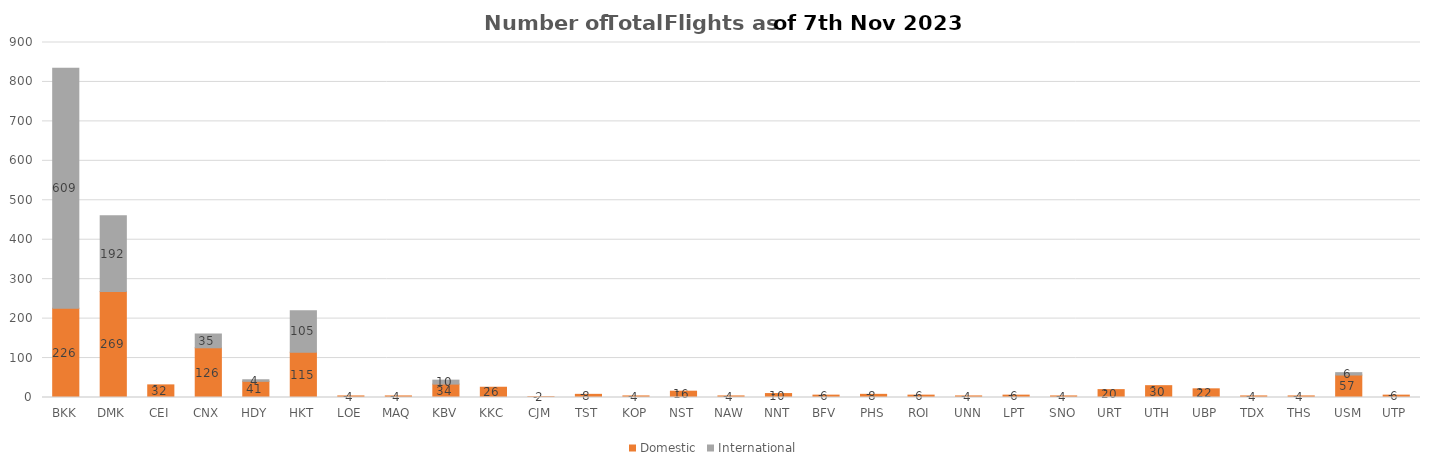
| Category | Domestic | International |
|---|---|---|
| BKK | 226 | 609 |
| DMK | 269 | 192 |
| CEI | 32 | 0 |
| CNX | 126 | 35 |
| HDY | 41 | 4 |
| HKT | 115 | 105 |
| LOE | 4 | 0 |
| MAQ | 4 | 0 |
| KBV | 34 | 10 |
| KKC | 26 | 0 |
| CJM | 2 | 0 |
| TST | 8 | 0 |
| KOP | 4 | 0 |
| NST | 16 | 0 |
| NAW | 4 | 0 |
| NNT | 10 | 0 |
| BFV | 6 | 0 |
| PHS | 8 | 0 |
| ROI | 6 | 0 |
| UNN | 4 | 0 |
| LPT | 6 | 0 |
| SNO | 4 | 0 |
| URT | 20 | 0 |
| UTH | 30 | 0 |
| UBP | 22 | 0 |
| TDX | 4 | 0 |
| THS | 4 | 0 |
| USM | 57 | 6 |
| UTP | 6 | 0 |